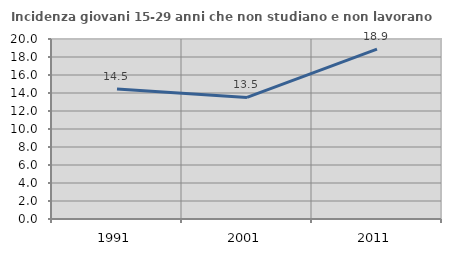
| Category | Incidenza giovani 15-29 anni che non studiano e non lavorano  |
|---|---|
| 1991.0 | 14.458 |
| 2001.0 | 13.514 |
| 2011.0 | 18.874 |